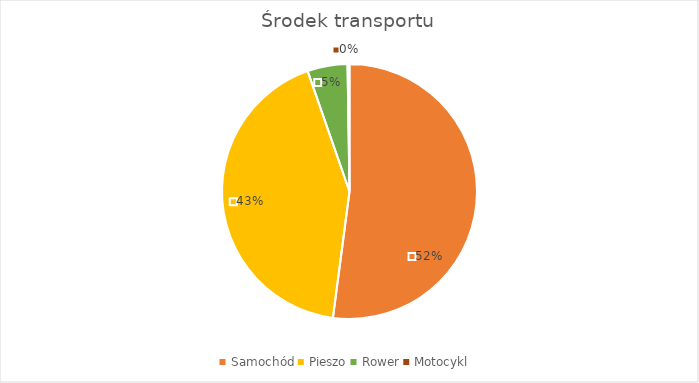
| Category | Series 0 |
|---|---|
| Samochód | 841 |
| Pieszo | 688 |
| Rower | 82 |
| Motocykl | 4 |